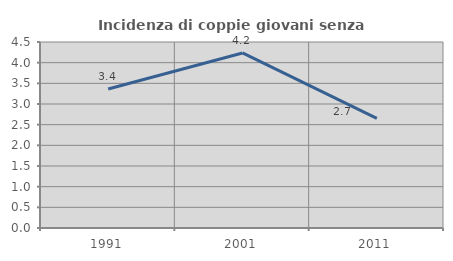
| Category | Incidenza di coppie giovani senza figli |
|---|---|
| 1991.0 | 3.361 |
| 2001.0 | 4.235 |
| 2011.0 | 2.653 |